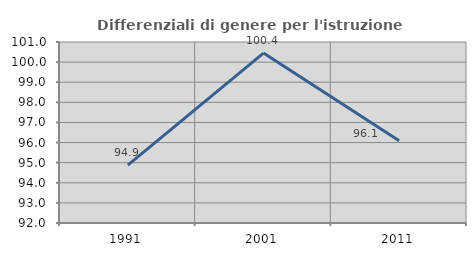
| Category | Differenziali di genere per l'istruzione superiore |
|---|---|
| 1991.0 | 94.881 |
| 2001.0 | 100.447 |
| 2011.0 | 96.094 |